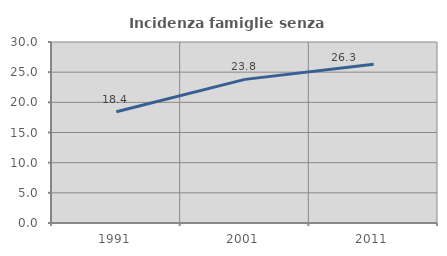
| Category | Incidenza famiglie senza nuclei |
|---|---|
| 1991.0 | 18.431 |
| 2001.0 | 23.806 |
| 2011.0 | 26.319 |